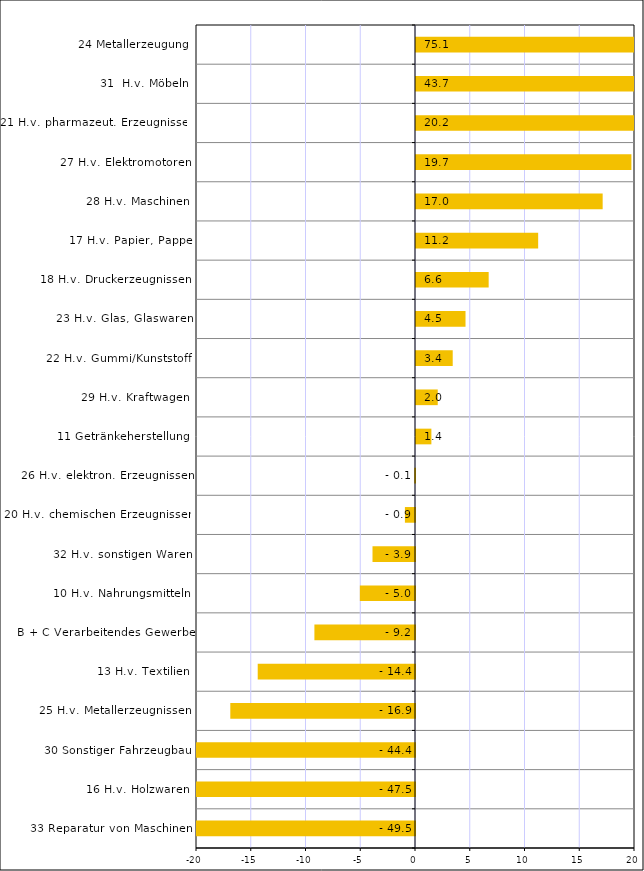
| Category | Series 0 |
|---|---|
| 33 Reparatur von Maschinen | -49.516 |
| 16 H.v. Holzwaren | -47.519 |
| 30 Sonstiger Fahrzeugbau | -44.378 |
| 25 H.v. Metallerzeugnissen | -16.866 |
| 13 H.v. Textilien | -14.363 |
| B + C Verarbeitendes Gewerbe | -9.186 |
| 10 H.v. Nahrungsmitteln | -5.035 |
| 32 H.v. sonstigen Waren | -3.881 |
| 20 H.v. chemischen Erzeugnissen | -0.922 |
| 26 H.v. elektron. Erzeugnissen | -0.071 |
| 11 Getränkeherstellung | 1.405 |
| 29 H.v. Kraftwagen | 1.985 |
| 22 H.v. Gummi/Kunststoff | 3.353 |
| 23 H.v. Glas, Glaswaren | 4.522 |
| 18 H.v. Druckerzeugnissen | 6.637 |
| 17 H.v. Papier, Pappe | 11.157 |
| 28 H.v. Maschinen | 17.047 |
| 27 H.v. Elektromotoren | 19.672 |
| 21 H.v. pharmazeut. Erzeugnissen | 20.219 |
| 31  H.v. Möbeln | 43.656 |
| 24 Metallerzeugung | 75.075 |